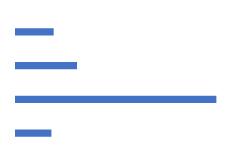
| Category | Series 0 |
|---|---|
| 1-10 Employees | 47 |
| 11-50 Employees | 266 |
| 51-100 Employees | 81 |
| 100-1000 Employees | 50 |